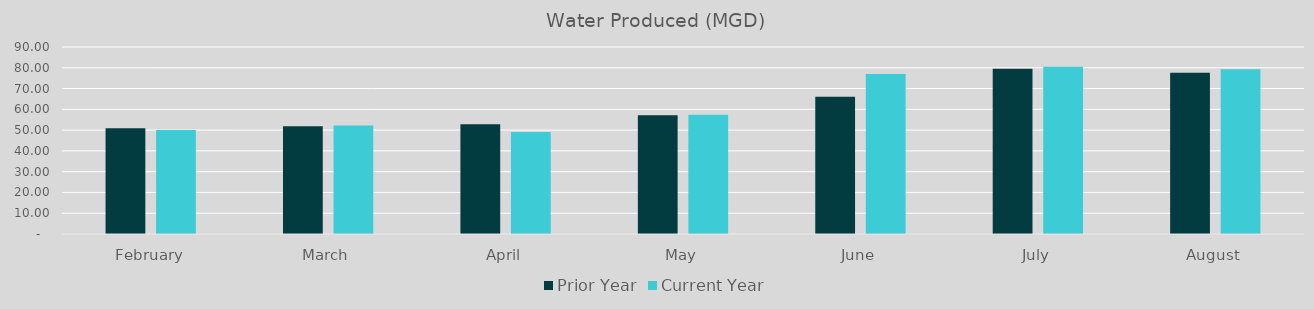
| Category | Prior Year | Current Year |
|---|---|---|
| February | 50.84 | 50.11 |
| March | 51.85 | 52.27 |
| April | 52.78 | 49.07 |
| May | 57.16 | 57.41 |
| June | 66.11 | 77.05 |
| July | 79.53 | 80.48 |
| August | 77.55 | 79.29 |